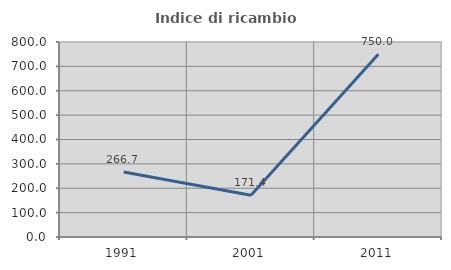
| Category | Indice di ricambio occupazionale  |
|---|---|
| 1991.0 | 266.667 |
| 2001.0 | 171.429 |
| 2011.0 | 750 |